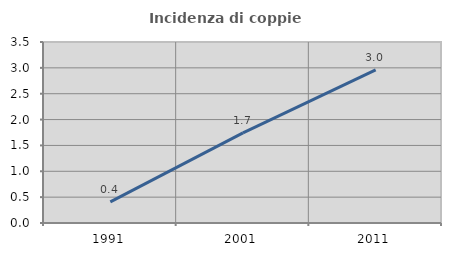
| Category | Incidenza di coppie miste |
|---|---|
| 1991.0 | 0.41 |
| 2001.0 | 1.744 |
| 2011.0 | 2.963 |